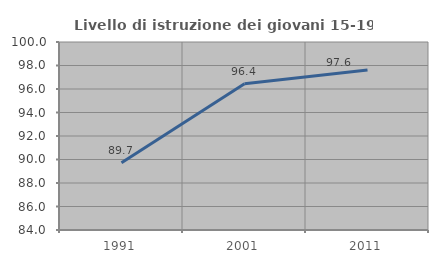
| Category | Livello di istruzione dei giovani 15-19 anni |
|---|---|
| 1991.0 | 89.714 |
| 2001.0 | 96.441 |
| 2011.0 | 97.625 |